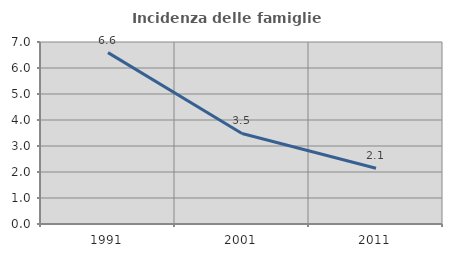
| Category | Incidenza delle famiglie numerose |
|---|---|
| 1991.0 | 6.591 |
| 2001.0 | 3.481 |
| 2011.0 | 2.142 |